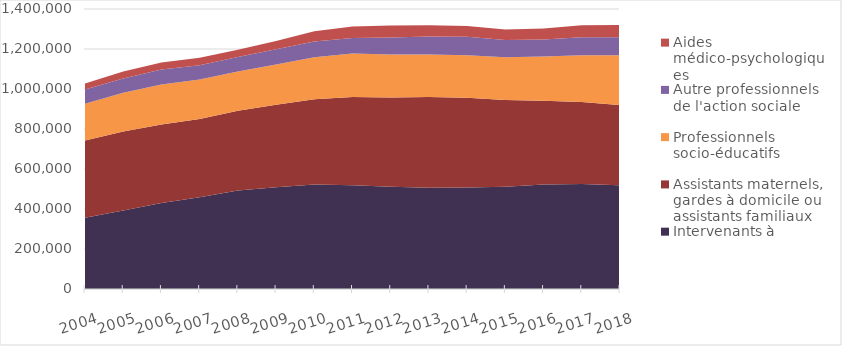
| Category | Intervenants à domicile | Assistants maternels, gardes à domicile ou assistants familiaux | Professionnels socio-éducatifs | Autre professionnels de l'action sociale | Aides médico-psychologiques |
|---|---|---|---|---|---|
| 2004.0 | 356000 | 386000 | 184000 | 71000 | 31000 |
| 2005.0 | 393000 | 395000 | 193000 | 72000 | 34000 |
| 2006.0 | 430000 | 392000 | 200000 | 75000 | 36000 |
| 2007.0 | 459000 | 391000 | 197000 | 72000 | 37000 |
| 2008.0 | 492000 | 399000 | 196000 | 73000 | 36000 |
| 2009.0 | 509000 | 412000 | 202000 | 76000 | 41000 |
| 2010.0 | 523000 | 426000 | 210000 | 79000 | 51000 |
| 2011.0 | 519000 | 441000 | 217000 | 78000 | 58000 |
| 2012.0 | 511000 | 447000 | 214000 | 86000 | 60000 |
| 2013.0 | 506000 | 454000 | 212000 | 91000 | 56000 |
| 2014.0 | 507000 | 449000 | 213000 | 92000 | 54000 |
| 2015.0 | 511000 | 434000 | 214000 | 86000 | 53000 |
| 2016.0 | 523000 | 418000 | 221000 | 85000 | 56000 |
| 2017.0 | 525000 | 410000 | 234000 | 90000 | 60000 |
| 2018.0 | 518000 | 401000 | 250000 | 90000 | 61000 |